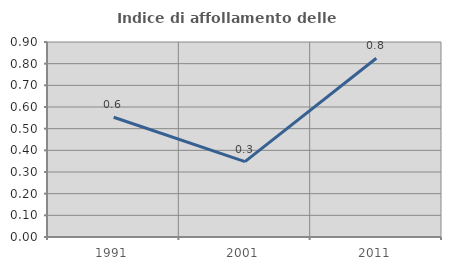
| Category | Indice di affollamento delle abitazioni  |
|---|---|
| 1991.0 | 0.552 |
| 2001.0 | 0.348 |
| 2011.0 | 0.825 |